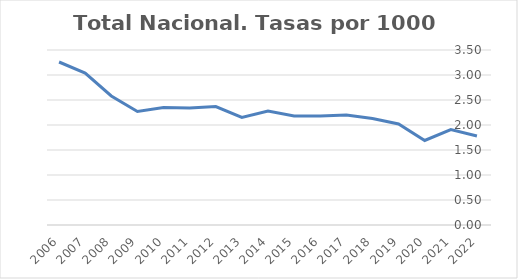
| Category | Total Nacional |
|---|---|
| 2022 | 1.78 |
| 2021 | 1.91 |
| 2020 | 1.69 |
| 2019 | 2.02 |
| 2018 | 2.13 |
| 2017 | 2.2 |
| 2016 | 2.18 |
| 2015 | 2.18 |
| 2014 | 2.28 |
| 2013 | 2.15 |
| 2012 | 2.37 |
| 2011 | 2.34 |
| 2010 | 2.35 |
| 2009 | 2.27 |
| 2008 | 2.58 |
| 2007 | 3.04 |
| 2006 | 3.26 |